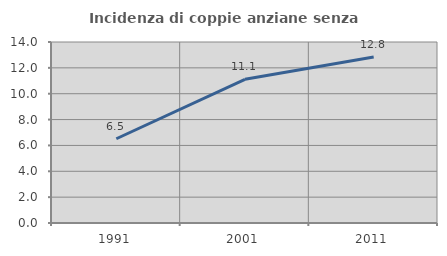
| Category | Incidenza di coppie anziane senza figli  |
|---|---|
| 1991.0 | 6.516 |
| 2001.0 | 11.111 |
| 2011.0 | 12.844 |